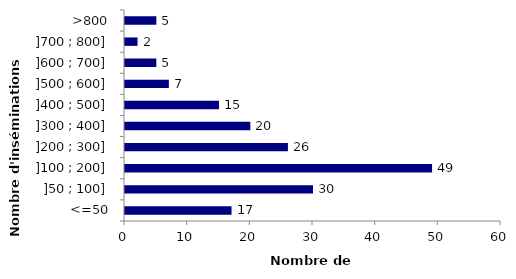
| Category | Series 0 |
|---|---|
| <=50 | 17 |
| ]50 ; 100] | 30 |
| ]100 ; 200] | 49 |
| ]200 ; 300] | 26 |
| ]300 ; 400] | 20 |
| ]400 ; 500] | 15 |
| ]500 ; 600] | 7 |
| ]600 ; 700] | 5 |
| ]700 ; 800] | 2 |
| >800 | 5 |